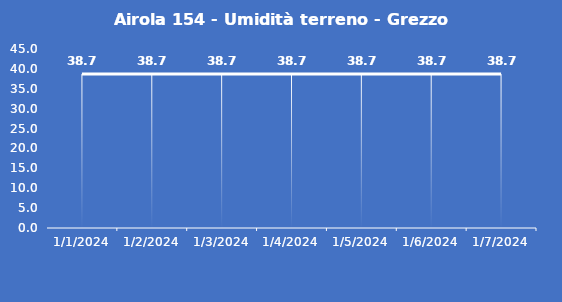
| Category | Airola 154 - Umidità terreno - Grezzo (%VWC) |
|---|---|
| 1/1/24 | 38.7 |
| 1/2/24 | 38.7 |
| 1/3/24 | 38.7 |
| 1/4/24 | 38.7 |
| 1/5/24 | 38.7 |
| 1/6/24 | 38.7 |
| 1/7/24 | 38.7 |